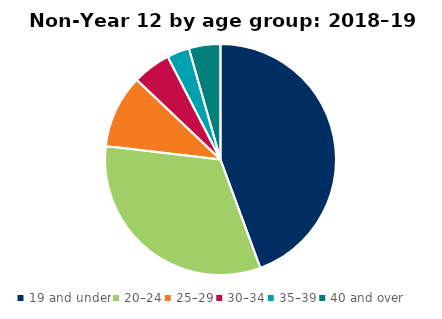
| Category | Series 0 |
|---|---|
| 19 and under | 5959 |
| 20–24 | 4359 |
| 25–29 | 1374 |
| 30–34 | 718 |
| 35–39 | 422 |
| 40 and over | 592 |